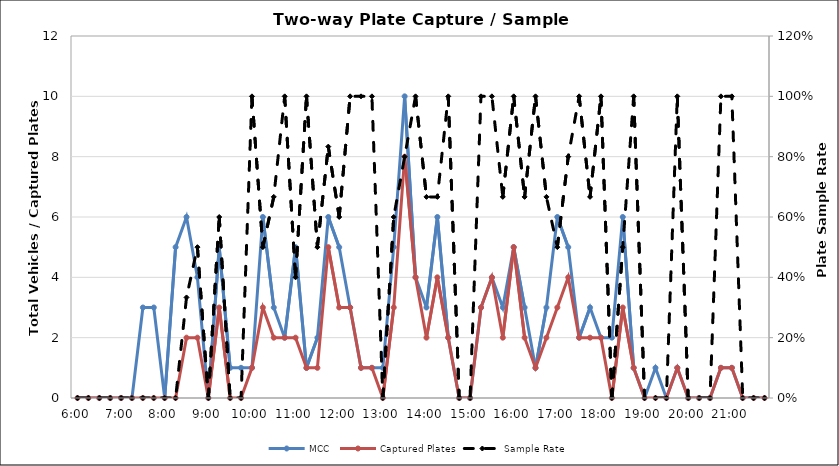
| Category | MCC | Captured Plates |
|---|---|---|
| 0.25 | 0 | 0 |
| 0.260416666666667 | 0 | 0 |
| 0.270833333333333 | 0 | 0 |
| 0.28125 | 0 | 0 |
| 0.291666666666667 | 0 | 0 |
| 0.302083333333333 | 0 | 0 |
| 0.3125 | 3 | 0 |
| 0.322916666666667 | 3 | 0 |
| 0.333333333333333 | 0 | 0 |
| 0.34375 | 5 | 0 |
| 0.354166666666667 | 6 | 2 |
| 0.364583333333333 | 4 | 2 |
| 0.375 | 0 | 0 |
| 0.385416666666667 | 5 | 3 |
| 0.395833333333333 | 1 | 0 |
| 0.40625 | 1 | 0 |
| 0.416666666666667 | 1 | 1 |
| 0.427083333333333 | 6 | 3 |
| 0.4375 | 3 | 2 |
| 0.447916666666667 | 2 | 2 |
| 0.458333333333333 | 5 | 2 |
| 0.46875 | 1 | 1 |
| 0.479166666666667 | 2 | 1 |
| 0.489583333333333 | 6 | 5 |
| 0.5 | 5 | 3 |
| 0.510416666666667 | 3 | 3 |
| 0.520833333333333 | 1 | 1 |
| 0.53125 | 1 | 1 |
| 0.541666666666667 | 1 | 0 |
| 0.552083333333333 | 5 | 3 |
| 0.5625 | 10 | 8 |
| 0.572916666666667 | 4 | 4 |
| 0.583333333333333 | 3 | 2 |
| 0.59375 | 6 | 4 |
| 0.604166666666667 | 2 | 2 |
| 0.614583333333333 | 0 | 0 |
| 0.625 | 0 | 0 |
| 0.635416666666667 | 3 | 3 |
| 0.645833333333333 | 4 | 4 |
| 0.65625 | 3 | 2 |
| 0.666666666666667 | 5 | 5 |
| 0.677083333333333 | 3 | 2 |
| 0.6875 | 1 | 1 |
| 0.697916666666667 | 3 | 2 |
| 0.708333333333333 | 6 | 3 |
| 0.71875 | 5 | 4 |
| 0.729166666666667 | 2 | 2 |
| 0.739583333333333 | 3 | 2 |
| 0.75 | 2 | 2 |
| 0.760416666666667 | 2 | 0 |
| 0.770833333333333 | 6 | 3 |
| 0.78125 | 1 | 1 |
| 0.791666666666667 | 0 | 0 |
| 0.802083333333333 | 1 | 0 |
| 0.8125 | 0 | 0 |
| 0.822916666666667 | 1 | 1 |
| 0.833333333333333 | 0 | 0 |
| 0.84375 | 0 | 0 |
| 0.854166666666667 | 0 | 0 |
| 0.864583333333333 | 1 | 1 |
| 0.875 | 1 | 1 |
| 0.885416666666667 | 0 | 0 |
| 0.895833333333333 | 0 | 0 |
| 0.90625 | 0 | 0 |